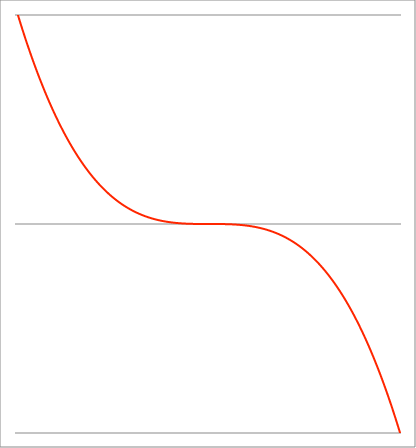
| Category | Series 1 |
|---|---|
| -1.01 | 1.03 |
| -1.00899 | 1.027 |
| -1.00798 | 1.024 |
| -1.00697 | 1.021 |
| -1.00596 | 1.018 |
| -1.00495 | 1.015 |
| -1.00394 | 1.012 |
| -1.00293 | 1.009 |
| -1.00192 | 1.006 |
| -1.00091 | 1.003 |
| -0.9999 | 1 |
| -0.99889 | 0.997 |
| -0.99788 | 0.994 |
| -0.996870000000001 | 0.991 |
| -0.995860000000001 | 0.988 |
| -0.994850000000001 | 0.985 |
| -0.993840000000001 | 0.982 |
| -0.992830000000001 | 0.979 |
| -0.991820000000001 | 0.976 |
| -0.990810000000001 | 0.973 |
| -0.989800000000001 | 0.97 |
| -0.988790000000001 | 0.967 |
| -0.987780000000001 | 0.964 |
| -0.986770000000001 | 0.961 |
| -0.985760000000001 | 0.958 |
| -0.984750000000001 | 0.955 |
| -0.983740000000001 | 0.952 |
| -0.982730000000001 | 0.949 |
| -0.981720000000001 | 0.946 |
| -0.980710000000001 | 0.943 |
| -0.979700000000001 | 0.94 |
| -0.978690000000001 | 0.937 |
| -0.977680000000001 | 0.935 |
| -0.976670000000001 | 0.932 |
| -0.975660000000001 | 0.929 |
| -0.974650000000002 | 0.926 |
| -0.973640000000002 | 0.923 |
| -0.972630000000002 | 0.92 |
| -0.971620000000002 | 0.917 |
| -0.970610000000002 | 0.914 |
| -0.969600000000002 | 0.912 |
| -0.968590000000002 | 0.909 |
| -0.967580000000002 | 0.906 |
| -0.966570000000002 | 0.903 |
| -0.965560000000002 | 0.9 |
| -0.964550000000002 | 0.897 |
| -0.963540000000002 | 0.895 |
| -0.962530000000002 | 0.892 |
| -0.961520000000002 | 0.889 |
| -0.960510000000002 | 0.886 |
| -0.959500000000002 | 0.883 |
| -0.958490000000002 | 0.881 |
| -0.957480000000002 | 0.878 |
| -0.956470000000002 | 0.875 |
| -0.955460000000002 | 0.872 |
| -0.954450000000002 | 0.869 |
| -0.953440000000002 | 0.867 |
| -0.952430000000003 | 0.864 |
| -0.951420000000003 | 0.861 |
| -0.950410000000003 | 0.858 |
| -0.949400000000003 | 0.856 |
| -0.948390000000003 | 0.853 |
| -0.947380000000003 | 0.85 |
| -0.946370000000003 | 0.848 |
| -0.945360000000003 | 0.845 |
| -0.944350000000003 | 0.842 |
| -0.943340000000003 | 0.839 |
| -0.942330000000003 | 0.837 |
| -0.941320000000003 | 0.834 |
| -0.940310000000003 | 0.831 |
| -0.939300000000003 | 0.829 |
| -0.938290000000003 | 0.826 |
| -0.937280000000003 | 0.823 |
| -0.936270000000003 | 0.821 |
| -0.935260000000003 | 0.818 |
| -0.934250000000003 | 0.815 |
| -0.933240000000003 | 0.813 |
| -0.932230000000003 | 0.81 |
| -0.931220000000003 | 0.808 |
| -0.930210000000004 | 0.805 |
| -0.929200000000004 | 0.802 |
| -0.928190000000004 | 0.8 |
| -0.927180000000004 | 0.797 |
| -0.926170000000004 | 0.794 |
| -0.925160000000004 | 0.792 |
| -0.924150000000004 | 0.789 |
| -0.923140000000004 | 0.787 |
| -0.922130000000004 | 0.784 |
| -0.921120000000004 | 0.782 |
| -0.920110000000004 | 0.779 |
| -0.919100000000004 | 0.776 |
| -0.918090000000004 | 0.774 |
| -0.917080000000004 | 0.771 |
| -0.916070000000004 | 0.769 |
| -0.915060000000004 | 0.766 |
| -0.914050000000004 | 0.764 |
| -0.913040000000004 | 0.761 |
| -0.912030000000004 | 0.759 |
| -0.911020000000004 | 0.756 |
| -0.910010000000004 | 0.754 |
| -0.909000000000004 | 0.751 |
| -0.907990000000004 | 0.749 |
| -0.906980000000005 | 0.746 |
| -0.905970000000005 | 0.744 |
| -0.904960000000005 | 0.741 |
| -0.903950000000005 | 0.739 |
| -0.902940000000005 | 0.736 |
| -0.901930000000005 | 0.734 |
| -0.900920000000005 | 0.731 |
| -0.899910000000005 | 0.729 |
| -0.898900000000005 | 0.726 |
| -0.897890000000005 | 0.724 |
| -0.896880000000005 | 0.721 |
| -0.895870000000005 | 0.719 |
| -0.894860000000005 | 0.717 |
| -0.893850000000005 | 0.714 |
| -0.892840000000005 | 0.712 |
| -0.891830000000005 | 0.709 |
| -0.890820000000005 | 0.707 |
| -0.889810000000005 | 0.705 |
| -0.888800000000005 | 0.702 |
| -0.887790000000005 | 0.7 |
| -0.886780000000005 | 0.697 |
| -0.885770000000005 | 0.695 |
| -0.884760000000005 | 0.693 |
| -0.883750000000006 | 0.69 |
| -0.882740000000006 | 0.688 |
| -0.881730000000006 | 0.685 |
| -0.880720000000006 | 0.683 |
| -0.879710000000006 | 0.681 |
| -0.878700000000006 | 0.678 |
| -0.877690000000006 | 0.676 |
| -0.876680000000006 | 0.674 |
| -0.875670000000006 | 0.671 |
| -0.874660000000006 | 0.669 |
| -0.873650000000006 | 0.667 |
| -0.872640000000006 | 0.665 |
| -0.871630000000006 | 0.662 |
| -0.870620000000006 | 0.66 |
| -0.869610000000006 | 0.658 |
| -0.868600000000006 | 0.655 |
| -0.867590000000006 | 0.653 |
| -0.866580000000006 | 0.651 |
| -0.865570000000006 | 0.648 |
| -0.864560000000006 | 0.646 |
| -0.863550000000006 | 0.644 |
| -0.862540000000006 | 0.642 |
| -0.861530000000007 | 0.639 |
| -0.860520000000007 | 0.637 |
| -0.859510000000007 | 0.635 |
| -0.858500000000007 | 0.633 |
| -0.857490000000007 | 0.631 |
| -0.856480000000007 | 0.628 |
| -0.855470000000007 | 0.626 |
| -0.854460000000007 | 0.624 |
| -0.853450000000007 | 0.622 |
| -0.852440000000007 | 0.619 |
| -0.851430000000007 | 0.617 |
| -0.850420000000007 | 0.615 |
| -0.849410000000007 | 0.613 |
| -0.848400000000007 | 0.611 |
| -0.847390000000007 | 0.608 |
| -0.846380000000007 | 0.606 |
| -0.845370000000007 | 0.604 |
| -0.844360000000007 | 0.602 |
| -0.843350000000007 | 0.6 |
| -0.842340000000007 | 0.598 |
| -0.841330000000007 | 0.596 |
| -0.840320000000007 | 0.593 |
| -0.839310000000007 | 0.591 |
| -0.838300000000008 | 0.589 |
| -0.837290000000008 | 0.587 |
| -0.836280000000008 | 0.585 |
| -0.835270000000008 | 0.583 |
| -0.834260000000008 | 0.581 |
| -0.833250000000008 | 0.579 |
| -0.832240000000008 | 0.576 |
| -0.831230000000008 | 0.574 |
| -0.830220000000008 | 0.572 |
| -0.829210000000008 | 0.57 |
| -0.828200000000008 | 0.568 |
| -0.827190000000008 | 0.566 |
| -0.826180000000008 | 0.564 |
| -0.825170000000008 | 0.562 |
| -0.824160000000008 | 0.56 |
| -0.823150000000008 | 0.558 |
| -0.822140000000008 | 0.556 |
| -0.821130000000008 | 0.554 |
| -0.820120000000008 | 0.552 |
| -0.819110000000008 | 0.55 |
| -0.818100000000008 | 0.548 |
| -0.817090000000008 | 0.546 |
| -0.816080000000009 | 0.543 |
| -0.815070000000009 | 0.541 |
| -0.814060000000009 | 0.539 |
| -0.813050000000009 | 0.537 |
| -0.812040000000009 | 0.535 |
| -0.811030000000009 | 0.533 |
| -0.810020000000009 | 0.531 |
| -0.809010000000009 | 0.529 |
| -0.808000000000009 | 0.528 |
| -0.806990000000009 | 0.526 |
| -0.805980000000009 | 0.524 |
| -0.804970000000009 | 0.522 |
| -0.803960000000009 | 0.52 |
| -0.802950000000009 | 0.518 |
| -0.801940000000009 | 0.516 |
| -0.800930000000009 | 0.514 |
| -0.799920000000009 | 0.512 |
| -0.798910000000009 | 0.51 |
| -0.797900000000009 | 0.508 |
| -0.796890000000009 | 0.506 |
| -0.795880000000009 | 0.504 |
| -0.794870000000009 | 0.502 |
| -0.793860000000009 | 0.5 |
| -0.79285000000001 | 0.498 |
| -0.79184000000001 | 0.496 |
| -0.79083000000001 | 0.495 |
| -0.78982000000001 | 0.493 |
| -0.78881000000001 | 0.491 |
| -0.78780000000001 | 0.489 |
| -0.78679000000001 | 0.487 |
| -0.78578000000001 | 0.485 |
| -0.78477000000001 | 0.483 |
| -0.78376000000001 | 0.481 |
| -0.78275000000001 | 0.48 |
| -0.78174000000001 | 0.478 |
| -0.78073000000001 | 0.476 |
| -0.77972000000001 | 0.474 |
| -0.77871000000001 | 0.472 |
| -0.77770000000001 | 0.47 |
| -0.77669000000001 | 0.469 |
| -0.77568000000001 | 0.467 |
| -0.77467000000001 | 0.465 |
| -0.77366000000001 | 0.463 |
| -0.77265000000001 | 0.461 |
| -0.77164000000001 | 0.459 |
| -0.770630000000011 | 0.458 |
| -0.769620000000011 | 0.456 |
| -0.768610000000011 | 0.454 |
| -0.767600000000011 | 0.452 |
| -0.766590000000011 | 0.45 |
| -0.765580000000011 | 0.449 |
| -0.764570000000011 | 0.447 |
| -0.763560000000011 | 0.445 |
| -0.762550000000011 | 0.443 |
| -0.761540000000011 | 0.442 |
| -0.760530000000011 | 0.44 |
| -0.759520000000011 | 0.438 |
| -0.758510000000011 | 0.436 |
| -0.757500000000011 | 0.435 |
| -0.756490000000011 | 0.433 |
| -0.755480000000011 | 0.431 |
| -0.754470000000011 | 0.429 |
| -0.753460000000011 | 0.428 |
| -0.752450000000011 | 0.426 |
| -0.751440000000011 | 0.424 |
| -0.750430000000011 | 0.423 |
| -0.749420000000011 | 0.421 |
| -0.748410000000011 | 0.419 |
| -0.747400000000012 | 0.418 |
| -0.746390000000012 | 0.416 |
| -0.745380000000012 | 0.414 |
| -0.744370000000012 | 0.412 |
| -0.743360000000012 | 0.411 |
| -0.742350000000012 | 0.409 |
| -0.741340000000012 | 0.407 |
| -0.740330000000012 | 0.406 |
| -0.739320000000012 | 0.404 |
| -0.738310000000012 | 0.402 |
| -0.737300000000012 | 0.401 |
| -0.736290000000012 | 0.399 |
| -0.735280000000012 | 0.398 |
| -0.734270000000012 | 0.396 |
| -0.733260000000012 | 0.394 |
| -0.732250000000012 | 0.393 |
| -0.731240000000012 | 0.391 |
| -0.730230000000012 | 0.389 |
| -0.729220000000012 | 0.388 |
| -0.728210000000012 | 0.386 |
| -0.727200000000012 | 0.385 |
| -0.726190000000012 | 0.383 |
| -0.725180000000013 | 0.381 |
| -0.724170000000013 | 0.38 |
| -0.723160000000013 | 0.378 |
| -0.722150000000013 | 0.377 |
| -0.721140000000013 | 0.375 |
| -0.720130000000013 | 0.373 |
| -0.719120000000013 | 0.372 |
| -0.718110000000013 | 0.37 |
| -0.717100000000013 | 0.369 |
| -0.716090000000013 | 0.367 |
| -0.715080000000013 | 0.366 |
| -0.714070000000013 | 0.364 |
| -0.713060000000013 | 0.363 |
| -0.712050000000013 | 0.361 |
| -0.711040000000013 | 0.359 |
| -0.710030000000013 | 0.358 |
| -0.709020000000013 | 0.356 |
| -0.708010000000013 | 0.355 |
| -0.707000000000013 | 0.353 |
| -0.705990000000013 | 0.352 |
| -0.704980000000013 | 0.35 |
| -0.703970000000013 | 0.349 |
| -0.702960000000014 | 0.347 |
| -0.701950000000014 | 0.346 |
| -0.700940000000014 | 0.344 |
| -0.699930000000014 | 0.343 |
| -0.698920000000014 | 0.341 |
| -0.697910000000014 | 0.34 |
| -0.696900000000014 | 0.338 |
| -0.695890000000014 | 0.337 |
| -0.694880000000014 | 0.336 |
| -0.693870000000014 | 0.334 |
| -0.692860000000014 | 0.333 |
| -0.691850000000014 | 0.331 |
| -0.690840000000014 | 0.33 |
| -0.689830000000014 | 0.328 |
| -0.688820000000014 | 0.327 |
| -0.687810000000014 | 0.325 |
| -0.686800000000014 | 0.324 |
| -0.685790000000014 | 0.323 |
| -0.684780000000014 | 0.321 |
| -0.683770000000014 | 0.32 |
| -0.682760000000014 | 0.318 |
| -0.681750000000014 | 0.317 |
| -0.680740000000014 | 0.315 |
| -0.679730000000015 | 0.314 |
| -0.678720000000015 | 0.313 |
| -0.677710000000015 | 0.311 |
| -0.676700000000015 | 0.31 |
| -0.675690000000015 | 0.308 |
| -0.674680000000015 | 0.307 |
| -0.673670000000015 | 0.306 |
| -0.672660000000015 | 0.304 |
| -0.671650000000015 | 0.303 |
| -0.670640000000015 | 0.302 |
| -0.669630000000015 | 0.3 |
| -0.668620000000015 | 0.299 |
| -0.667610000000015 | 0.298 |
| -0.666600000000015 | 0.296 |
| -0.665590000000015 | 0.295 |
| -0.664580000000015 | 0.294 |
| -0.663570000000015 | 0.292 |
| -0.662560000000015 | 0.291 |
| -0.661550000000015 | 0.29 |
| -0.660540000000015 | 0.288 |
| -0.659530000000015 | 0.287 |
| -0.658520000000015 | 0.286 |
| -0.657510000000015 | 0.284 |
| -0.656500000000016 | 0.283 |
| -0.655490000000016 | 0.282 |
| -0.654480000000016 | 0.28 |
| -0.653470000000016 | 0.279 |
| -0.652460000000016 | 0.278 |
| -0.651450000000016 | 0.276 |
| -0.650440000000016 | 0.275 |
| -0.649430000000016 | 0.274 |
| -0.648420000000016 | 0.273 |
| -0.647410000000016 | 0.271 |
| -0.646400000000016 | 0.27 |
| -0.645390000000016 | 0.269 |
| -0.644380000000016 | 0.268 |
| -0.643370000000016 | 0.266 |
| -0.642360000000016 | 0.265 |
| -0.641350000000016 | 0.264 |
| -0.640340000000016 | 0.263 |
| -0.639330000000016 | 0.261 |
| -0.638320000000016 | 0.26 |
| -0.637310000000016 | 0.259 |
| -0.636300000000016 | 0.258 |
| -0.635290000000016 | 0.256 |
| -0.634280000000017 | 0.255 |
| -0.633270000000017 | 0.254 |
| -0.632260000000017 | 0.253 |
| -0.631250000000017 | 0.252 |
| -0.630240000000017 | 0.25 |
| -0.629230000000017 | 0.249 |
| -0.628220000000017 | 0.248 |
| -0.627210000000017 | 0.247 |
| -0.626200000000017 | 0.246 |
| -0.625190000000017 | 0.244 |
| -0.624180000000017 | 0.243 |
| -0.623170000000017 | 0.242 |
| -0.622160000000017 | 0.241 |
| -0.621150000000017 | 0.24 |
| -0.620140000000017 | 0.238 |
| -0.619130000000017 | 0.237 |
| -0.618120000000017 | 0.236 |
| -0.617110000000017 | 0.235 |
| -0.616100000000017 | 0.234 |
| -0.615090000000017 | 0.233 |
| -0.614080000000017 | 0.232 |
| -0.613070000000017 | 0.23 |
| -0.612060000000017 | 0.229 |
| -0.611050000000018 | 0.228 |
| -0.610040000000018 | 0.227 |
| -0.609030000000018 | 0.226 |
| -0.608020000000018 | 0.225 |
| -0.607010000000018 | 0.224 |
| -0.606000000000018 | 0.223 |
| -0.604990000000018 | 0.221 |
| -0.603980000000018 | 0.22 |
| -0.602970000000018 | 0.219 |
| -0.601960000000018 | 0.218 |
| -0.600950000000018 | 0.217 |
| -0.599940000000018 | 0.216 |
| -0.598930000000018 | 0.215 |
| -0.597920000000018 | 0.214 |
| -0.596910000000018 | 0.213 |
| -0.595900000000018 | 0.212 |
| -0.594890000000018 | 0.211 |
| -0.593880000000018 | 0.209 |
| -0.592870000000018 | 0.208 |
| -0.591860000000018 | 0.207 |
| -0.590850000000019 | 0.206 |
| -0.589840000000019 | 0.205 |
| -0.588830000000019 | 0.204 |
| -0.587820000000019 | 0.203 |
| -0.586810000000019 | 0.202 |
| -0.585800000000019 | 0.201 |
| -0.584790000000019 | 0.2 |
| -0.583780000000019 | 0.199 |
| -0.582770000000019 | 0.198 |
| -0.581760000000019 | 0.197 |
| -0.580750000000019 | 0.196 |
| -0.579740000000019 | 0.195 |
| -0.578730000000019 | 0.194 |
| -0.577720000000019 | 0.193 |
| -0.576710000000019 | 0.192 |
| -0.575700000000019 | 0.191 |
| -0.574690000000019 | 0.19 |
| -0.573680000000019 | 0.189 |
| -0.572670000000019 | 0.188 |
| -0.571660000000019 | 0.187 |
| -0.570650000000019 | 0.186 |
| -0.569640000000019 | 0.185 |
| -0.568630000000019 | 0.184 |
| -0.56762000000002 | 0.183 |
| -0.56661000000002 | 0.182 |
| -0.56560000000002 | 0.181 |
| -0.56459000000002 | 0.18 |
| -0.56358000000002 | 0.179 |
| -0.56257000000002 | 0.178 |
| -0.56156000000002 | 0.177 |
| -0.56055000000002 | 0.176 |
| -0.55954000000002 | 0.175 |
| -0.55853000000002 | 0.174 |
| -0.55752000000002 | 0.173 |
| -0.55651000000002 | 0.172 |
| -0.55550000000002 | 0.171 |
| -0.55449000000002 | 0.17 |
| -0.55348000000002 | 0.17 |
| -0.55247000000002 | 0.169 |
| -0.55146000000002 | 0.168 |
| -0.55045000000002 | 0.167 |
| -0.54944000000002 | 0.166 |
| -0.54843000000002 | 0.165 |
| -0.54742000000002 | 0.164 |
| -0.54641000000002 | 0.163 |
| -0.545400000000021 | 0.162 |
| -0.544390000000021 | 0.161 |
| -0.543380000000021 | 0.16 |
| -0.542370000000021 | 0.16 |
| -0.541360000000021 | 0.159 |
| -0.540350000000021 | 0.158 |
| -0.539340000000021 | 0.157 |
| -0.538330000000021 | 0.156 |
| -0.537320000000021 | 0.155 |
| -0.536310000000021 | 0.154 |
| -0.535300000000021 | 0.153 |
| -0.534290000000021 | 0.153 |
| -0.533280000000021 | 0.152 |
| -0.532270000000021 | 0.151 |
| -0.531260000000021 | 0.15 |
| -0.530250000000021 | 0.149 |
| -0.529240000000021 | 0.148 |
| -0.528230000000021 | 0.147 |
| -0.527220000000021 | 0.147 |
| -0.526210000000021 | 0.146 |
| -0.525200000000021 | 0.145 |
| -0.524190000000021 | 0.144 |
| -0.523180000000022 | 0.143 |
| -0.522170000000022 | 0.142 |
| -0.521160000000022 | 0.142 |
| -0.520150000000022 | 0.141 |
| -0.519140000000022 | 0.14 |
| -0.518130000000022 | 0.139 |
| -0.517120000000022 | 0.138 |
| -0.516110000000022 | 0.137 |
| -0.515100000000022 | 0.137 |
| -0.514090000000022 | 0.136 |
| -0.513080000000022 | 0.135 |
| -0.512070000000022 | 0.134 |
| -0.511060000000022 | 0.133 |
| -0.510050000000022 | 0.133 |
| -0.509040000000022 | 0.132 |
| -0.508030000000022 | 0.131 |
| -0.507020000000022 | 0.13 |
| -0.506010000000022 | 0.13 |
| -0.505000000000022 | 0.129 |
| -0.503990000000022 | 0.128 |
| -0.502980000000022 | 0.127 |
| -0.501970000000022 | 0.126 |
| -0.500960000000022 | 0.126 |
| -0.499950000000022 | 0.125 |
| -0.498940000000022 | 0.124 |
| -0.497930000000022 | 0.123 |
| -0.496920000000022 | 0.123 |
| -0.495910000000022 | 0.122 |
| -0.494900000000022 | 0.121 |
| -0.493890000000022 | 0.12 |
| -0.492880000000022 | 0.12 |
| -0.491870000000022 | 0.119 |
| -0.490860000000022 | 0.118 |
| -0.489850000000022 | 0.118 |
| -0.488840000000022 | 0.117 |
| -0.487830000000022 | 0.116 |
| -0.486820000000022 | 0.115 |
| -0.485810000000022 | 0.115 |
| -0.484800000000022 | 0.114 |
| -0.483790000000022 | 0.113 |
| -0.482780000000022 | 0.113 |
| -0.481770000000022 | 0.112 |
| -0.480760000000022 | 0.111 |
| -0.479750000000022 | 0.11 |
| -0.478740000000022 | 0.11 |
| -0.477730000000022 | 0.109 |
| -0.476720000000022 | 0.108 |
| -0.475710000000022 | 0.108 |
| -0.474700000000022 | 0.107 |
| -0.473690000000022 | 0.106 |
| -0.472680000000022 | 0.106 |
| -0.471670000000022 | 0.105 |
| -0.470660000000022 | 0.104 |
| -0.469650000000022 | 0.104 |
| -0.468640000000022 | 0.103 |
| -0.467630000000022 | 0.102 |
| -0.466620000000022 | 0.102 |
| -0.465610000000022 | 0.101 |
| -0.464600000000022 | 0.1 |
| -0.463590000000022 | 0.1 |
| -0.462580000000022 | 0.099 |
| -0.461570000000022 | 0.098 |
| -0.460560000000022 | 0.098 |
| -0.459550000000022 | 0.097 |
| -0.458540000000022 | 0.096 |
| -0.457530000000022 | 0.096 |
| -0.456520000000022 | 0.095 |
| -0.455510000000022 | 0.095 |
| -0.454500000000022 | 0.094 |
| -0.453490000000022 | 0.093 |
| -0.452480000000022 | 0.093 |
| -0.451470000000022 | 0.092 |
| -0.450460000000022 | 0.091 |
| -0.449450000000022 | 0.091 |
| -0.448440000000022 | 0.09 |
| -0.447430000000022 | 0.09 |
| -0.446420000000022 | 0.089 |
| -0.445410000000022 | 0.088 |
| -0.444400000000022 | 0.088 |
| -0.443390000000022 | 0.087 |
| -0.442380000000022 | 0.087 |
| -0.441370000000022 | 0.086 |
| -0.440360000000022 | 0.085 |
| -0.439350000000022 | 0.085 |
| -0.438340000000022 | 0.084 |
| -0.437330000000022 | 0.084 |
| -0.436320000000022 | 0.083 |
| -0.435310000000022 | 0.082 |
| -0.434300000000022 | 0.082 |
| -0.433290000000022 | 0.081 |
| -0.432280000000022 | 0.081 |
| -0.431270000000022 | 0.08 |
| -0.430260000000022 | 0.08 |
| -0.429250000000022 | 0.079 |
| -0.428240000000022 | 0.079 |
| -0.427230000000022 | 0.078 |
| -0.426220000000022 | 0.077 |
| -0.425210000000022 | 0.077 |
| -0.424200000000022 | 0.076 |
| -0.423190000000022 | 0.076 |
| -0.422180000000022 | 0.075 |
| -0.421170000000022 | 0.075 |
| -0.420160000000022 | 0.074 |
| -0.419150000000022 | 0.074 |
| -0.418140000000022 | 0.073 |
| -0.417130000000022 | 0.073 |
| -0.416120000000022 | 0.072 |
| -0.415110000000022 | 0.072 |
| -0.414100000000022 | 0.071 |
| -0.413090000000022 | 0.07 |
| -0.412080000000022 | 0.07 |
| -0.411070000000022 | 0.069 |
| -0.410060000000021 | 0.069 |
| -0.409050000000021 | 0.068 |
| -0.408040000000021 | 0.068 |
| -0.407030000000021 | 0.067 |
| -0.406020000000021 | 0.067 |
| -0.405010000000021 | 0.066 |
| -0.404000000000021 | 0.066 |
| -0.402990000000021 | 0.065 |
| -0.401980000000021 | 0.065 |
| -0.400970000000021 | 0.064 |
| -0.399960000000021 | 0.064 |
| -0.398950000000021 | 0.063 |
| -0.397940000000021 | 0.063 |
| -0.396930000000021 | 0.063 |
| -0.395920000000021 | 0.062 |
| -0.394910000000021 | 0.062 |
| -0.393900000000021 | 0.061 |
| -0.392890000000021 | 0.061 |
| -0.391880000000021 | 0.06 |
| -0.390870000000021 | 0.06 |
| -0.389860000000021 | 0.059 |
| -0.388850000000021 | 0.059 |
| -0.387840000000021 | 0.058 |
| -0.386830000000021 | 0.058 |
| -0.385820000000021 | 0.057 |
| -0.384810000000021 | 0.057 |
| -0.383800000000021 | 0.057 |
| -0.382790000000021 | 0.056 |
| -0.381780000000021 | 0.056 |
| -0.380770000000021 | 0.055 |
| -0.379760000000021 | 0.055 |
| -0.378750000000021 | 0.054 |
| -0.377740000000021 | 0.054 |
| -0.376730000000021 | 0.053 |
| -0.375720000000021 | 0.053 |
| -0.374710000000021 | 0.053 |
| -0.373700000000021 | 0.052 |
| -0.372690000000021 | 0.052 |
| -0.371680000000021 | 0.051 |
| -0.370670000000021 | 0.051 |
| -0.369660000000021 | 0.051 |
| -0.368650000000021 | 0.05 |
| -0.367640000000021 | 0.05 |
| -0.366630000000021 | 0.049 |
| -0.365620000000021 | 0.049 |
| -0.364610000000021 | 0.048 |
| -0.363600000000021 | 0.048 |
| -0.362590000000021 | 0.048 |
| -0.361580000000021 | 0.047 |
| -0.360570000000021 | 0.047 |
| -0.359560000000021 | 0.046 |
| -0.358550000000021 | 0.046 |
| -0.357540000000021 | 0.046 |
| -0.356530000000021 | 0.045 |
| -0.355520000000021 | 0.045 |
| -0.354510000000021 | 0.045 |
| -0.353500000000021 | 0.044 |
| -0.352490000000021 | 0.044 |
| -0.351480000000021 | 0.043 |
| -0.350470000000021 | 0.043 |
| -0.349460000000021 | 0.043 |
| -0.348450000000021 | 0.042 |
| -0.347440000000021 | 0.042 |
| -0.346430000000021 | 0.042 |
| -0.345420000000021 | 0.041 |
| -0.344410000000021 | 0.041 |
| -0.343400000000021 | 0.04 |
| -0.342390000000021 | 0.04 |
| -0.341380000000021 | 0.04 |
| -0.340370000000021 | 0.039 |
| -0.339360000000021 | 0.039 |
| -0.338350000000021 | 0.039 |
| -0.337340000000021 | 0.038 |
| -0.336330000000021 | 0.038 |
| -0.335320000000021 | 0.038 |
| -0.334310000000021 | 0.037 |
| -0.333300000000021 | 0.037 |
| -0.332290000000021 | 0.037 |
| -0.331280000000021 | 0.036 |
| -0.330270000000021 | 0.036 |
| -0.329260000000021 | 0.036 |
| -0.328250000000021 | 0.035 |
| -0.327240000000021 | 0.035 |
| -0.326230000000021 | 0.035 |
| -0.325220000000021 | 0.034 |
| -0.324210000000021 | 0.034 |
| -0.323200000000021 | 0.034 |
| -0.322190000000021 | 0.033 |
| -0.321180000000021 | 0.033 |
| -0.320170000000021 | 0.033 |
| -0.31916000000002 | 0.033 |
| -0.31815000000002 | 0.032 |
| -0.31714000000002 | 0.032 |
| -0.31613000000002 | 0.032 |
| -0.31512000000002 | 0.031 |
| -0.31411000000002 | 0.031 |
| -0.31310000000002 | 0.031 |
| -0.31209000000002 | 0.03 |
| -0.31108000000002 | 0.03 |
| -0.31007000000002 | 0.03 |
| -0.30906000000002 | 0.03 |
| -0.30805000000002 | 0.029 |
| -0.30704000000002 | 0.029 |
| -0.30603000000002 | 0.029 |
| -0.30502000000002 | 0.028 |
| -0.30401000000002 | 0.028 |
| -0.30300000000002 | 0.028 |
| -0.30199000000002 | 0.028 |
| -0.30098000000002 | 0.027 |
| -0.29997000000002 | 0.027 |
| -0.29896000000002 | 0.027 |
| -0.29795000000002 | 0.026 |
| -0.29694000000002 | 0.026 |
| -0.29593000000002 | 0.026 |
| -0.29492000000002 | 0.026 |
| -0.29391000000002 | 0.025 |
| -0.29290000000002 | 0.025 |
| -0.29189000000002 | 0.025 |
| -0.29088000000002 | 0.025 |
| -0.28987000000002 | 0.024 |
| -0.28886000000002 | 0.024 |
| -0.28785000000002 | 0.024 |
| -0.28684000000002 | 0.024 |
| -0.28583000000002 | 0.023 |
| -0.28482000000002 | 0.023 |
| -0.28381000000002 | 0.023 |
| -0.28280000000002 | 0.023 |
| -0.28179000000002 | 0.022 |
| -0.28078000000002 | 0.022 |
| -0.27977000000002 | 0.022 |
| -0.27876000000002 | 0.022 |
| -0.27775000000002 | 0.021 |
| -0.27674000000002 | 0.021 |
| -0.27573000000002 | 0.021 |
| -0.27472000000002 | 0.021 |
| -0.27371000000002 | 0.021 |
| -0.27270000000002 | 0.02 |
| -0.27169000000002 | 0.02 |
| -0.27068000000002 | 0.02 |
| -0.26967000000002 | 0.02 |
| -0.26866000000002 | 0.019 |
| -0.26765000000002 | 0.019 |
| -0.26664000000002 | 0.019 |
| -0.26563000000002 | 0.019 |
| -0.26462000000002 | 0.019 |
| -0.26361000000002 | 0.018 |
| -0.26260000000002 | 0.018 |
| -0.26159000000002 | 0.018 |
| -0.26058000000002 | 0.018 |
| -0.25957000000002 | 0.017 |
| -0.25856000000002 | 0.017 |
| -0.25755000000002 | 0.017 |
| -0.25654000000002 | 0.017 |
| -0.25553000000002 | 0.017 |
| -0.25452000000002 | 0.016 |
| -0.25351000000002 | 0.016 |
| -0.25250000000002 | 0.016 |
| -0.25149000000002 | 0.016 |
| -0.25048000000002 | 0.016 |
| -0.24947000000002 | 0.016 |
| -0.24846000000002 | 0.015 |
| -0.24745000000002 | 0.015 |
| -0.24644000000002 | 0.015 |
| -0.24543000000002 | 0.015 |
| -0.24442000000002 | 0.015 |
| -0.24341000000002 | 0.014 |
| -0.24240000000002 | 0.014 |
| -0.24139000000002 | 0.014 |
| -0.24038000000002 | 0.014 |
| -0.23937000000002 | 0.014 |
| -0.23836000000002 | 0.014 |
| -0.23735000000002 | 0.013 |
| -0.23634000000002 | 0.013 |
| -0.23533000000002 | 0.013 |
| -0.23432000000002 | 0.013 |
| -0.23331000000002 | 0.013 |
| -0.23230000000002 | 0.013 |
| -0.23129000000002 | 0.012 |
| -0.23028000000002 | 0.012 |
| -0.22927000000002 | 0.012 |
| -0.22826000000002 | 0.012 |
| -0.22725000000002 | 0.012 |
| -0.22624000000002 | 0.012 |
| -0.22523000000002 | 0.011 |
| -0.224220000000019 | 0.011 |
| -0.223210000000019 | 0.011 |
| -0.222200000000019 | 0.011 |
| -0.221190000000019 | 0.011 |
| -0.220180000000019 | 0.011 |
| -0.219170000000019 | 0.011 |
| -0.218160000000019 | 0.01 |
| -0.217150000000019 | 0.01 |
| -0.216140000000019 | 0.01 |
| -0.215130000000019 | 0.01 |
| -0.214120000000019 | 0.01 |
| -0.213110000000019 | 0.01 |
| -0.212100000000019 | 0.01 |
| -0.211090000000019 | 0.009 |
| -0.210080000000019 | 0.009 |
| -0.209070000000019 | 0.009 |
| -0.208060000000019 | 0.009 |
| -0.207050000000019 | 0.009 |
| -0.206040000000019 | 0.009 |
| -0.205030000000019 | 0.009 |
| -0.204020000000019 | 0.008 |
| -0.203010000000019 | 0.008 |
| -0.202000000000019 | 0.008 |
| -0.200990000000019 | 0.008 |
| -0.199980000000019 | 0.008 |
| -0.198970000000019 | 0.008 |
| -0.197960000000019 | 0.008 |
| -0.196950000000019 | 0.008 |
| -0.195940000000019 | 0.008 |
| -0.194930000000019 | 0.007 |
| -0.193920000000019 | 0.007 |
| -0.192910000000019 | 0.007 |
| -0.191900000000019 | 0.007 |
| -0.190890000000019 | 0.007 |
| -0.189880000000019 | 0.007 |
| -0.188870000000019 | 0.007 |
| -0.187860000000019 | 0.007 |
| -0.186850000000019 | 0.007 |
| -0.185840000000019 | 0.006 |
| -0.184830000000019 | 0.006 |
| -0.183820000000019 | 0.006 |
| -0.182810000000019 | 0.006 |
| -0.181800000000019 | 0.006 |
| -0.180790000000019 | 0.006 |
| -0.179780000000019 | 0.006 |
| -0.178770000000019 | 0.006 |
| -0.177760000000019 | 0.006 |
| -0.176750000000019 | 0.006 |
| -0.175740000000019 | 0.005 |
| -0.174730000000019 | 0.005 |
| -0.173720000000019 | 0.005 |
| -0.172710000000019 | 0.005 |
| -0.171700000000019 | 0.005 |
| -0.170690000000019 | 0.005 |
| -0.169680000000019 | 0.005 |
| -0.168670000000019 | 0.005 |
| -0.167660000000019 | 0.005 |
| -0.166650000000019 | 0.005 |
| -0.165640000000019 | 0.005 |
| -0.164630000000019 | 0.004 |
| -0.163620000000019 | 0.004 |
| -0.162610000000019 | 0.004 |
| -0.161600000000019 | 0.004 |
| -0.160590000000019 | 0.004 |
| -0.159580000000019 | 0.004 |
| -0.158570000000019 | 0.004 |
| -0.157560000000019 | 0.004 |
| -0.156550000000019 | 0.004 |
| -0.155540000000019 | 0.004 |
| -0.154530000000019 | 0.004 |
| -0.153520000000019 | 0.004 |
| -0.152510000000019 | 0.004 |
| -0.151500000000019 | 0.003 |
| -0.150490000000019 | 0.003 |
| -0.149480000000019 | 0.003 |
| -0.148470000000019 | 0.003 |
| -0.147460000000019 | 0.003 |
| -0.146450000000019 | 0.003 |
| -0.145440000000019 | 0.003 |
| -0.144430000000019 | 0.003 |
| -0.143420000000019 | 0.003 |
| -0.142410000000019 | 0.003 |
| -0.141400000000019 | 0.003 |
| -0.140390000000019 | 0.003 |
| -0.139380000000019 | 0.003 |
| -0.138370000000019 | 0.003 |
| -0.137360000000019 | 0.003 |
| -0.136350000000019 | 0.003 |
| -0.135340000000019 | 0.002 |
| -0.134330000000019 | 0.002 |
| -0.133320000000019 | 0.002 |
| -0.132310000000019 | 0.002 |
| -0.131300000000019 | 0.002 |
| -0.130290000000018 | 0.002 |
| -0.129280000000018 | 0.002 |
| -0.128270000000018 | 0.002 |
| -0.127260000000018 | 0.002 |
| -0.126250000000018 | 0.002 |
| -0.125240000000018 | 0.002 |
| -0.124230000000018 | 0.002 |
| -0.123220000000018 | 0.002 |
| -0.122210000000018 | 0.002 |
| -0.121200000000018 | 0.002 |
| -0.120190000000018 | 0.002 |
| -0.119180000000018 | 0.002 |
| -0.118170000000018 | 0.002 |
| -0.117160000000018 | 0.002 |
| -0.116150000000018 | 0.002 |
| -0.115140000000018 | 0.002 |
| -0.114130000000018 | 0.001 |
| -0.113120000000018 | 0.001 |
| -0.112110000000018 | 0.001 |
| -0.111100000000018 | 0.001 |
| -0.110090000000018 | 0.001 |
| -0.109080000000018 | 0.001 |
| -0.108070000000018 | 0.001 |
| -0.107060000000018 | 0.001 |
| -0.106050000000018 | 0.001 |
| -0.105040000000019 | 0.001 |
| -0.104030000000019 | 0.001 |
| -0.103020000000019 | 0.001 |
| -0.102010000000019 | 0.001 |
| -0.101000000000019 | 0.001 |
| -0.0999900000000185 | 0.001 |
| -0.0989800000000185 | 0.001 |
| -0.0979700000000185 | 0.001 |
| -0.0969600000000185 | 0.001 |
| -0.0959500000000185 | 0.001 |
| -0.0949400000000185 | 0.001 |
| -0.0939300000000185 | 0.001 |
| -0.0929200000000185 | 0.001 |
| -0.0919100000000185 | 0.001 |
| -0.0909000000000185 | 0.001 |
| -0.0898900000000185 | 0.001 |
| -0.0888800000000185 | 0.001 |
| -0.0878700000000185 | 0.001 |
| -0.0868600000000185 | 0.001 |
| -0.0858500000000185 | 0.001 |
| -0.0848400000000186 | 0.001 |
| -0.0838300000000186 | 0.001 |
| -0.0828200000000186 | 0.001 |
| -0.0818100000000186 | 0.001 |
| -0.0808000000000186 | 0.001 |
| -0.0797900000000186 | 0.001 |
| -0.0787800000000186 | 0 |
| -0.0777700000000186 | 0 |
| -0.0767600000000186 | 0 |
| -0.0757500000000186 | 0 |
| -0.0747400000000186 | 0 |
| -0.0737300000000186 | 0 |
| -0.0727200000000186 | 0 |
| -0.0717100000000186 | 0 |
| -0.0707000000000186 | 0 |
| -0.0696900000000186 | 0 |
| -0.0686800000000186 | 0 |
| -0.0676700000000186 | 0 |
| -0.0666600000000186 | 0 |
| -0.0656500000000186 | 0 |
| -0.0646400000000186 | 0 |
| -0.0636300000000186 | 0 |
| -0.0626200000000186 | 0 |
| -0.0616100000000186 | 0 |
| -0.0606000000000186 | 0 |
| -0.0595900000000186 | 0 |
| -0.0585800000000186 | 0 |
| -0.0575700000000186 | 0 |
| -0.0565600000000186 | 0 |
| -0.0555500000000186 | 0 |
| -0.0545400000000186 | 0 |
| -0.0535300000000186 | 0 |
| -0.0525200000000187 | 0 |
| -0.0515100000000187 | 0 |
| -0.0505000000000187 | 0 |
| -0.0494900000000187 | 0 |
| -0.0484800000000187 | 0 |
| -0.0474700000000187 | 0 |
| -0.0464600000000187 | 0 |
| -0.0454500000000187 | 0 |
| -0.0444400000000187 | 0 |
| -0.0434300000000187 | 0 |
| -0.0424200000000187 | 0 |
| -0.0414100000000187 | 0 |
| -0.0404000000000187 | 0 |
| -0.0393900000000187 | 0 |
| -0.0383800000000187 | 0 |
| -0.0373700000000187 | 0 |
| -0.0363600000000187 | 0 |
| -0.0353500000000187 | 0 |
| -0.0343400000000187 | 0 |
| -0.0333300000000187 | 0 |
| -0.0323200000000187 | 0 |
| -0.0313100000000187 | 0 |
| -0.0303000000000187 | 0 |
| -0.0292900000000187 | 0 |
| -0.0282800000000187 | 0 |
| -0.0272700000000187 | 0 |
| -0.0262600000000187 | 0 |
| -0.0252500000000187 | 0 |
| -0.0242400000000187 | 0 |
| -0.0232300000000187 | 0 |
| -0.0222200000000187 | 0 |
| -0.0212100000000187 | 0 |
| -0.0202000000000187 | 0 |
| -0.0191900000000187 | 0 |
| -0.0181800000000187 | 0 |
| -0.0171700000000187 | 0 |
| -0.0161600000000187 | 0 |
| -0.0151500000000187 | 0 |
| -0.0141400000000187 | 0 |
| -0.0131300000000187 | 0 |
| -0.0121200000000187 | 0 |
| -0.0111100000000187 | 0 |
| -0.0101000000000187 | 0 |
| -0.00909000000001871 | 0 |
| -0.00808000000001871 | 0 |
| -0.00707000000001871 | 0 |
| -0.00606000000001871 | 0 |
| -0.00505000000001871 | 0 |
| -0.00404000000001871 | 0 |
| -0.00303000000001871 | 0 |
| -0.00202000000001871 | 0 |
| -0.00101000000001871 | 0 |
| -1.87124621353618e-14 | 0 |
| 0.00100999999998129 | 0 |
| 0.00201999999998129 | 0 |
| 0.00302999999998129 | 0 |
| 0.00403999999998129 | 0 |
| 0.00504999999998129 | 0 |
| 0.00605999999998129 | 0 |
| 0.00706999999998129 | 0 |
| 0.00807999999998129 | 0 |
| 0.00908999999998129 | 0 |
| 0.0100999999999813 | 0 |
| 0.0111099999999813 | 0 |
| 0.0121199999999813 | 0 |
| 0.0131299999999813 | 0 |
| 0.0141399999999813 | 0 |
| 0.0151499999999813 | 0 |
| 0.0161599999999813 | 0 |
| 0.0171699999999813 | 0 |
| 0.0181799999999813 | 0 |
| 0.0191899999999813 | 0 |
| 0.0201999999999813 | 0 |
| 0.0212099999999813 | 0 |
| 0.0222199999999813 | 0 |
| 0.0232299999999813 | 0 |
| 0.0242399999999813 | 0 |
| 0.0252499999999813 | 0 |
| 0.0262599999999813 | 0 |
| 0.0272699999999813 | 0 |
| 0.0282799999999813 | 0 |
| 0.0292899999999813 | 0 |
| 0.0302999999999813 | 0 |
| 0.0313099999999813 | 0 |
| 0.0323199999999813 | 0 |
| 0.0333299999999813 | 0 |
| 0.0343399999999813 | 0 |
| 0.0353499999999813 | 0 |
| 0.0363599999999813 | 0 |
| 0.0373699999999813 | 0 |
| 0.0383799999999813 | 0 |
| 0.0393899999999813 | 0 |
| 0.0403999999999813 | 0 |
| 0.0414099999999813 | 0 |
| 0.0424199999999813 | 0 |
| 0.0434299999999813 | 0 |
| 0.0444399999999812 | 0 |
| 0.0454499999999812 | 0 |
| 0.0464599999999812 | 0 |
| 0.0474699999999812 | 0 |
| 0.0484799999999812 | 0 |
| 0.0494899999999812 | 0 |
| 0.0504999999999812 | 0 |
| 0.0515099999999812 | 0 |
| 0.0525199999999812 | 0 |
| 0.0535299999999812 | 0 |
| 0.0545399999999812 | 0 |
| 0.0555499999999812 | 0 |
| 0.0565599999999812 | 0 |
| 0.0575699999999812 | 0 |
| 0.0585799999999812 | 0 |
| 0.0595899999999812 | 0 |
| 0.0605999999999812 | 0 |
| 0.0616099999999812 | 0 |
| 0.0626199999999812 | 0 |
| 0.0636299999999812 | 0 |
| 0.0646399999999812 | 0 |
| 0.0656499999999812 | 0 |
| 0.0666599999999812 | 0 |
| 0.0676699999999812 | 0 |
| 0.0686799999999812 | 0 |
| 0.0696899999999812 | 0 |
| 0.0706999999999812 | 0 |
| 0.0717099999999812 | 0 |
| 0.0727199999999812 | 0 |
| 0.0737299999999812 | 0 |
| 0.0747399999999812 | 0 |
| 0.0757499999999812 | 0 |
| 0.0767599999999812 | 0 |
| 0.0777699999999812 | 0 |
| 0.0787799999999811 | 0 |
| 0.0797899999999811 | -0.001 |
| 0.0807999999999811 | -0.001 |
| 0.0818099999999811 | -0.001 |
| 0.0828199999999811 | -0.001 |
| 0.0838299999999811 | -0.001 |
| 0.0848399999999811 | -0.001 |
| 0.0858499999999811 | -0.001 |
| 0.0868599999999811 | -0.001 |
| 0.0878699999999811 | -0.001 |
| 0.0888799999999811 | -0.001 |
| 0.0898899999999811 | -0.001 |
| 0.0908999999999811 | -0.001 |
| 0.0919099999999811 | -0.001 |
| 0.0929199999999811 | -0.001 |
| 0.0939299999999811 | -0.001 |
| 0.0949399999999811 | -0.001 |
| 0.0959499999999811 | -0.001 |
| 0.0969599999999811 | -0.001 |
| 0.0979699999999811 | -0.001 |
| 0.0989799999999811 | -0.001 |
| 0.0999899999999811 | -0.001 |
| 0.100999999999981 | -0.001 |
| 0.102009999999981 | -0.001 |
| 0.103019999999981 | -0.001 |
| 0.104029999999981 | -0.001 |
| 0.105039999999981 | -0.001 |
| 0.106049999999981 | -0.001 |
| 0.107059999999981 | -0.001 |
| 0.108069999999981 | -0.001 |
| 0.109079999999981 | -0.001 |
| 0.110089999999981 | -0.001 |
| 0.111099999999981 | -0.001 |
| 0.112109999999981 | -0.001 |
| 0.113119999999981 | -0.001 |
| 0.114129999999981 | -0.001 |
| 0.115139999999981 | -0.002 |
| 0.116149999999981 | -0.002 |
| 0.117159999999981 | -0.002 |
| 0.118169999999981 | -0.002 |
| 0.119179999999981 | -0.002 |
| 0.120189999999981 | -0.002 |
| 0.121199999999981 | -0.002 |
| 0.122209999999981 | -0.002 |
| 0.123219999999981 | -0.002 |
| 0.124229999999981 | -0.002 |
| 0.125239999999981 | -0.002 |
| 0.126249999999981 | -0.002 |
| 0.127259999999981 | -0.002 |
| 0.128269999999981 | -0.002 |
| 0.129279999999981 | -0.002 |
| 0.130289999999981 | -0.002 |
| 0.131299999999981 | -0.002 |
| 0.132309999999981 | -0.002 |
| 0.133319999999981 | -0.002 |
| 0.134329999999981 | -0.002 |
| 0.135339999999981 | -0.002 |
| 0.136349999999981 | -0.003 |
| 0.137359999999981 | -0.003 |
| 0.138369999999981 | -0.003 |
| 0.139379999999981 | -0.003 |
| 0.140389999999981 | -0.003 |
| 0.141399999999981 | -0.003 |
| 0.142409999999981 | -0.003 |
| 0.143419999999981 | -0.003 |
| 0.144429999999981 | -0.003 |
| 0.145439999999981 | -0.003 |
| 0.146449999999981 | -0.003 |
| 0.147459999999981 | -0.003 |
| 0.148469999999981 | -0.003 |
| 0.149479999999981 | -0.003 |
| 0.150489999999981 | -0.003 |
| 0.151499999999981 | -0.003 |
| 0.152509999999981 | -0.004 |
| 0.153519999999981 | -0.004 |
| 0.154529999999981 | -0.004 |
| 0.155539999999981 | -0.004 |
| 0.156549999999981 | -0.004 |
| 0.157559999999981 | -0.004 |
| 0.158569999999981 | -0.004 |
| 0.159579999999981 | -0.004 |
| 0.160589999999981 | -0.004 |
| 0.161599999999981 | -0.004 |
| 0.162609999999981 | -0.004 |
| 0.163619999999981 | -0.004 |
| 0.164629999999981 | -0.004 |
| 0.165639999999981 | -0.005 |
| 0.166649999999981 | -0.005 |
| 0.167659999999981 | -0.005 |
| 0.168669999999981 | -0.005 |
| 0.169679999999981 | -0.005 |
| 0.170689999999982 | -0.005 |
| 0.171699999999982 | -0.005 |
| 0.172709999999982 | -0.005 |
| 0.173719999999982 | -0.005 |
| 0.174729999999982 | -0.005 |
| 0.175739999999982 | -0.005 |
| 0.176749999999982 | -0.006 |
| 0.177759999999982 | -0.006 |
| 0.178769999999982 | -0.006 |
| 0.179779999999982 | -0.006 |
| 0.180789999999982 | -0.006 |
| 0.181799999999982 | -0.006 |
| 0.182809999999982 | -0.006 |
| 0.183819999999982 | -0.006 |
| 0.184829999999982 | -0.006 |
| 0.185839999999982 | -0.006 |
| 0.186849999999982 | -0.007 |
| 0.187859999999982 | -0.007 |
| 0.188869999999982 | -0.007 |
| 0.189879999999982 | -0.007 |
| 0.190889999999982 | -0.007 |
| 0.191899999999982 | -0.007 |
| 0.192909999999982 | -0.007 |
| 0.193919999999982 | -0.007 |
| 0.194929999999982 | -0.007 |
| 0.195939999999982 | -0.008 |
| 0.196949999999982 | -0.008 |
| 0.197959999999982 | -0.008 |
| 0.198969999999982 | -0.008 |
| 0.199979999999982 | -0.008 |
| 0.200989999999982 | -0.008 |
| 0.201999999999982 | -0.008 |
| 0.203009999999982 | -0.008 |
| 0.204019999999982 | -0.008 |
| 0.205029999999982 | -0.009 |
| 0.206039999999982 | -0.009 |
| 0.207049999999982 | -0.009 |
| 0.208059999999982 | -0.009 |
| 0.209069999999982 | -0.009 |
| 0.210079999999982 | -0.009 |
| 0.211089999999982 | -0.009 |
| 0.212099999999982 | -0.01 |
| 0.213109999999982 | -0.01 |
| 0.214119999999982 | -0.01 |
| 0.215129999999982 | -0.01 |
| 0.216139999999982 | -0.01 |
| 0.217149999999982 | -0.01 |
| 0.218159999999982 | -0.01 |
| 0.219169999999982 | -0.011 |
| 0.220179999999982 | -0.011 |
| 0.221189999999982 | -0.011 |
| 0.222199999999982 | -0.011 |
| 0.223209999999982 | -0.011 |
| 0.224219999999982 | -0.011 |
| 0.225229999999982 | -0.011 |
| 0.226239999999982 | -0.012 |
| 0.227249999999982 | -0.012 |
| 0.228259999999982 | -0.012 |
| 0.229269999999982 | -0.012 |
| 0.230279999999982 | -0.012 |
| 0.231289999999982 | -0.012 |
| 0.232299999999982 | -0.013 |
| 0.233309999999982 | -0.013 |
| 0.234319999999982 | -0.013 |
| 0.235329999999982 | -0.013 |
| 0.236339999999982 | -0.013 |
| 0.237349999999982 | -0.013 |
| 0.238359999999982 | -0.014 |
| 0.239369999999982 | -0.014 |
| 0.240379999999982 | -0.014 |
| 0.241389999999982 | -0.014 |
| 0.242399999999982 | -0.014 |
| 0.243409999999982 | -0.014 |
| 0.244419999999982 | -0.015 |
| 0.245429999999982 | -0.015 |
| 0.246439999999982 | -0.015 |
| 0.247449999999982 | -0.015 |
| 0.248459999999982 | -0.015 |
| 0.249469999999982 | -0.016 |
| 0.250479999999982 | -0.016 |
| 0.251489999999982 | -0.016 |
| 0.252499999999982 | -0.016 |
| 0.253509999999982 | -0.016 |
| 0.254519999999982 | -0.016 |
| 0.255529999999982 | -0.017 |
| 0.256539999999982 | -0.017 |
| 0.257549999999982 | -0.017 |
| 0.258559999999982 | -0.017 |
| 0.259569999999982 | -0.017 |
| 0.260579999999982 | -0.018 |
| 0.261589999999982 | -0.018 |
| 0.262599999999982 | -0.018 |
| 0.263609999999983 | -0.018 |
| 0.264619999999983 | -0.019 |
| 0.265629999999983 | -0.019 |
| 0.266639999999983 | -0.019 |
| 0.267649999999983 | -0.019 |
| 0.268659999999983 | -0.019 |
| 0.269669999999983 | -0.02 |
| 0.270679999999983 | -0.02 |
| 0.271689999999983 | -0.02 |
| 0.272699999999983 | -0.02 |
| 0.273709999999983 | -0.021 |
| 0.274719999999983 | -0.021 |
| 0.275729999999983 | -0.021 |
| 0.276739999999983 | -0.021 |
| 0.277749999999983 | -0.021 |
| 0.278759999999983 | -0.022 |
| 0.279769999999983 | -0.022 |
| 0.280779999999983 | -0.022 |
| 0.281789999999983 | -0.022 |
| 0.282799999999983 | -0.023 |
| 0.283809999999983 | -0.023 |
| 0.284819999999983 | -0.023 |
| 0.285829999999983 | -0.023 |
| 0.286839999999983 | -0.024 |
| 0.287849999999983 | -0.024 |
| 0.288859999999983 | -0.024 |
| 0.289869999999983 | -0.024 |
| 0.290879999999983 | -0.025 |
| 0.291889999999983 | -0.025 |
| 0.292899999999983 | -0.025 |
| 0.293909999999983 | -0.025 |
| 0.294919999999983 | -0.026 |
| 0.295929999999983 | -0.026 |
| 0.296939999999983 | -0.026 |
| 0.297949999999983 | -0.026 |
| 0.298959999999983 | -0.027 |
| 0.299969999999983 | -0.027 |
| 0.300979999999983 | -0.027 |
| 0.301989999999983 | -0.028 |
| 0.302999999999983 | -0.028 |
| 0.304009999999983 | -0.028 |
| 0.305019999999983 | -0.028 |
| 0.306029999999983 | -0.029 |
| 0.307039999999983 | -0.029 |
| 0.308049999999983 | -0.029 |
| 0.309059999999983 | -0.03 |
| 0.310069999999983 | -0.03 |
| 0.311079999999983 | -0.03 |
| 0.312089999999983 | -0.03 |
| 0.313099999999983 | -0.031 |
| 0.314109999999983 | -0.031 |
| 0.315119999999983 | -0.031 |
| 0.316129999999983 | -0.032 |
| 0.317139999999983 | -0.032 |
| 0.318149999999983 | -0.032 |
| 0.319159999999983 | -0.033 |
| 0.320169999999983 | -0.033 |
| 0.321179999999983 | -0.033 |
| 0.322189999999983 | -0.033 |
| 0.323199999999983 | -0.034 |
| 0.324209999999983 | -0.034 |
| 0.325219999999983 | -0.034 |
| 0.326229999999983 | -0.035 |
| 0.327239999999983 | -0.035 |
| 0.328249999999983 | -0.035 |
| 0.329259999999983 | -0.036 |
| 0.330269999999983 | -0.036 |
| 0.331279999999983 | -0.036 |
| 0.332289999999983 | -0.037 |
| 0.333299999999983 | -0.037 |
| 0.334309999999983 | -0.037 |
| 0.335319999999983 | -0.038 |
| 0.336329999999983 | -0.038 |
| 0.337339999999983 | -0.038 |
| 0.338349999999983 | -0.039 |
| 0.339359999999983 | -0.039 |
| 0.340369999999983 | -0.039 |
| 0.341379999999983 | -0.04 |
| 0.342389999999983 | -0.04 |
| 0.343399999999983 | -0.04 |
| 0.344409999999983 | -0.041 |
| 0.345419999999983 | -0.041 |
| 0.346429999999983 | -0.042 |
| 0.347439999999983 | -0.042 |
| 0.348449999999983 | -0.042 |
| 0.349459999999983 | -0.043 |
| 0.350469999999983 | -0.043 |
| 0.351479999999983 | -0.043 |
| 0.352489999999983 | -0.044 |
| 0.353499999999983 | -0.044 |
| 0.354509999999983 | -0.045 |
| 0.355519999999983 | -0.045 |
| 0.356529999999983 | -0.045 |
| 0.357539999999983 | -0.046 |
| 0.358549999999983 | -0.046 |
| 0.359559999999984 | -0.046 |
| 0.360569999999984 | -0.047 |
| 0.361579999999984 | -0.047 |
| 0.362589999999984 | -0.048 |
| 0.363599999999984 | -0.048 |
| 0.364609999999984 | -0.048 |
| 0.365619999999984 | -0.049 |
| 0.366629999999984 | -0.049 |
| 0.367639999999984 | -0.05 |
| 0.368649999999984 | -0.05 |
| 0.369659999999984 | -0.051 |
| 0.370669999999984 | -0.051 |
| 0.371679999999984 | -0.051 |
| 0.372689999999984 | -0.052 |
| 0.373699999999984 | -0.052 |
| 0.374709999999984 | -0.053 |
| 0.375719999999984 | -0.053 |
| 0.376729999999984 | -0.053 |
| 0.377739999999984 | -0.054 |
| 0.378749999999984 | -0.054 |
| 0.379759999999984 | -0.055 |
| 0.380769999999984 | -0.055 |
| 0.381779999999984 | -0.056 |
| 0.382789999999984 | -0.056 |
| 0.383799999999984 | -0.057 |
| 0.384809999999984 | -0.057 |
| 0.385819999999984 | -0.057 |
| 0.386829999999984 | -0.058 |
| 0.387839999999984 | -0.058 |
| 0.388849999999984 | -0.059 |
| 0.389859999999984 | -0.059 |
| 0.390869999999984 | -0.06 |
| 0.391879999999984 | -0.06 |
| 0.392889999999984 | -0.061 |
| 0.393899999999984 | -0.061 |
| 0.394909999999984 | -0.062 |
| 0.395919999999984 | -0.062 |
| 0.396929999999984 | -0.063 |
| 0.397939999999984 | -0.063 |
| 0.398949999999984 | -0.063 |
| 0.399959999999984 | -0.064 |
| 0.400969999999984 | -0.064 |
| 0.401979999999984 | -0.065 |
| 0.402989999999984 | -0.065 |
| 0.403999999999984 | -0.066 |
| 0.405009999999984 | -0.066 |
| 0.406019999999984 | -0.067 |
| 0.407029999999984 | -0.067 |
| 0.408039999999984 | -0.068 |
| 0.409049999999984 | -0.068 |
| 0.410059999999984 | -0.069 |
| 0.411069999999984 | -0.069 |
| 0.412079999999984 | -0.07 |
| 0.413089999999984 | -0.07 |
| 0.414099999999984 | -0.071 |
| 0.415109999999984 | -0.072 |
| 0.416119999999984 | -0.072 |
| 0.417129999999984 | -0.073 |
| 0.418139999999984 | -0.073 |
| 0.419149999999984 | -0.074 |
| 0.420159999999984 | -0.074 |
| 0.421169999999984 | -0.075 |
| 0.422179999999984 | -0.075 |
| 0.423189999999984 | -0.076 |
| 0.424199999999984 | -0.076 |
| 0.425209999999984 | -0.077 |
| 0.426219999999984 | -0.077 |
| 0.427229999999984 | -0.078 |
| 0.428239999999984 | -0.079 |
| 0.429249999999984 | -0.079 |
| 0.430259999999984 | -0.08 |
| 0.431269999999984 | -0.08 |
| 0.432279999999984 | -0.081 |
| 0.433289999999984 | -0.081 |
| 0.434299999999984 | -0.082 |
| 0.435309999999984 | -0.082 |
| 0.436319999999984 | -0.083 |
| 0.437329999999984 | -0.084 |
| 0.438339999999984 | -0.084 |
| 0.439349999999984 | -0.085 |
| 0.440359999999984 | -0.085 |
| 0.441369999999984 | -0.086 |
| 0.442379999999984 | -0.087 |
| 0.443389999999984 | -0.087 |
| 0.444399999999984 | -0.088 |
| 0.445409999999984 | -0.088 |
| 0.446419999999984 | -0.089 |
| 0.447429999999984 | -0.09 |
| 0.448439999999984 | -0.09 |
| 0.449449999999984 | -0.091 |
| 0.450459999999985 | -0.091 |
| 0.451469999999985 | -0.092 |
| 0.452479999999985 | -0.093 |
| 0.453489999999985 | -0.093 |
| 0.454499999999985 | -0.094 |
| 0.455509999999985 | -0.095 |
| 0.456519999999985 | -0.095 |
| 0.457529999999985 | -0.096 |
| 0.458539999999985 | -0.096 |
| 0.459549999999985 | -0.097 |
| 0.460559999999985 | -0.098 |
| 0.461569999999985 | -0.098 |
| 0.462579999999985 | -0.099 |
| 0.463589999999985 | -0.1 |
| 0.464599999999985 | -0.1 |
| 0.465609999999985 | -0.101 |
| 0.466619999999985 | -0.102 |
| 0.467629999999985 | -0.102 |
| 0.468639999999985 | -0.103 |
| 0.469649999999985 | -0.104 |
| 0.470659999999985 | -0.104 |
| 0.471669999999985 | -0.105 |
| 0.472679999999985 | -0.106 |
| 0.473689999999985 | -0.106 |
| 0.474699999999985 | -0.107 |
| 0.475709999999985 | -0.108 |
| 0.476719999999985 | -0.108 |
| 0.477729999999985 | -0.109 |
| 0.478739999999985 | -0.11 |
| 0.479749999999985 | -0.11 |
| 0.480759999999985 | -0.111 |
| 0.481769999999985 | -0.112 |
| 0.482779999999985 | -0.113 |
| 0.483789999999985 | -0.113 |
| 0.484799999999985 | -0.114 |
| 0.485809999999985 | -0.115 |
| 0.486819999999985 | -0.115 |
| 0.487829999999985 | -0.116 |
| 0.488839999999985 | -0.117 |
| 0.489849999999985 | -0.118 |
| 0.490859999999985 | -0.118 |
| 0.491869999999985 | -0.119 |
| 0.492879999999985 | -0.12 |
| 0.493889999999985 | -0.12 |
| 0.494899999999985 | -0.121 |
| 0.495909999999985 | -0.122 |
| 0.496919999999985 | -0.123 |
| 0.497929999999985 | -0.123 |
| 0.498939999999985 | -0.124 |
| 0.499949999999985 | -0.125 |
| 0.500959999999985 | -0.126 |
| 0.501969999999985 | -0.126 |
| 0.502979999999985 | -0.127 |
| 0.503989999999985 | -0.128 |
| 0.504999999999985 | -0.129 |
| 0.506009999999985 | -0.13 |
| 0.507019999999985 | -0.13 |
| 0.508029999999985 | -0.131 |
| 0.509039999999985 | -0.132 |
| 0.510049999999985 | -0.133 |
| 0.511059999999985 | -0.133 |
| 0.512069999999985 | -0.134 |
| 0.513079999999985 | -0.135 |
| 0.514089999999985 | -0.136 |
| 0.515099999999984 | -0.137 |
| 0.516109999999984 | -0.137 |
| 0.517119999999984 | -0.138 |
| 0.518129999999984 | -0.139 |
| 0.519139999999984 | -0.14 |
| 0.520149999999984 | -0.141 |
| 0.521159999999984 | -0.142 |
| 0.522169999999984 | -0.142 |
| 0.523179999999984 | -0.143 |
| 0.524189999999984 | -0.144 |
| 0.525199999999984 | -0.145 |
| 0.526209999999984 | -0.146 |
| 0.527219999999984 | -0.147 |
| 0.528229999999984 | -0.147 |
| 0.529239999999984 | -0.148 |
| 0.530249999999984 | -0.149 |
| 0.531259999999984 | -0.15 |
| 0.532269999999984 | -0.151 |
| 0.533279999999984 | -0.152 |
| 0.534289999999984 | -0.153 |
| 0.535299999999984 | -0.153 |
| 0.536309999999984 | -0.154 |
| 0.537319999999983 | -0.155 |
| 0.538329999999983 | -0.156 |
| 0.539339999999983 | -0.157 |
| 0.540349999999983 | -0.158 |
| 0.541359999999983 | -0.159 |
| 0.542369999999983 | -0.16 |
| 0.543379999999983 | -0.16 |
| 0.544389999999983 | -0.161 |
| 0.545399999999983 | -0.162 |
| 0.546409999999983 | -0.163 |
| 0.547419999999983 | -0.164 |
| 0.548429999999983 | -0.165 |
| 0.549439999999983 | -0.166 |
| 0.550449999999983 | -0.167 |
| 0.551459999999983 | -0.168 |
| 0.552469999999983 | -0.169 |
| 0.553479999999983 | -0.17 |
| 0.554489999999983 | -0.17 |
| 0.555499999999983 | -0.171 |
| 0.556509999999983 | -0.172 |
| 0.557519999999983 | -0.173 |
| 0.558529999999983 | -0.174 |
| 0.559539999999982 | -0.175 |
| 0.560549999999982 | -0.176 |
| 0.561559999999982 | -0.177 |
| 0.562569999999982 | -0.178 |
| 0.563579999999982 | -0.179 |
| 0.564589999999982 | -0.18 |
| 0.565599999999982 | -0.181 |
| 0.566609999999982 | -0.182 |
| 0.567619999999982 | -0.183 |
| 0.568629999999982 | -0.184 |
| 0.569639999999982 | -0.185 |
| 0.570649999999982 | -0.186 |
| 0.571659999999982 | -0.187 |
| 0.572669999999982 | -0.188 |
| 0.573679999999982 | -0.189 |
| 0.574689999999982 | -0.19 |
| 0.575699999999982 | -0.191 |
| 0.576709999999982 | -0.192 |
| 0.577719999999982 | -0.193 |
| 0.578729999999982 | -0.194 |
| 0.579739999999982 | -0.195 |
| 0.580749999999982 | -0.196 |
| 0.581759999999981 | -0.197 |
| 0.582769999999981 | -0.198 |
| 0.583779999999981 | -0.199 |
| 0.584789999999981 | -0.2 |
| 0.585799999999981 | -0.201 |
| 0.586809999999981 | -0.202 |
| 0.587819999999981 | -0.203 |
| 0.588829999999981 | -0.204 |
| 0.589839999999981 | -0.205 |
| 0.590849999999981 | -0.206 |
| 0.591859999999981 | -0.207 |
| 0.592869999999981 | -0.208 |
| 0.593879999999981 | -0.209 |
| 0.594889999999981 | -0.211 |
| 0.595899999999981 | -0.212 |
| 0.596909999999981 | -0.213 |
| 0.597919999999981 | -0.214 |
| 0.598929999999981 | -0.215 |
| 0.599939999999981 | -0.216 |
| 0.600949999999981 | -0.217 |
| 0.601959999999981 | -0.218 |
| 0.60296999999998 | -0.219 |
| 0.60397999999998 | -0.22 |
| 0.60498999999998 | -0.221 |
| 0.60599999999998 | -0.223 |
| 0.60700999999998 | -0.224 |
| 0.60801999999998 | -0.225 |
| 0.60902999999998 | -0.226 |
| 0.61003999999998 | -0.227 |
| 0.61104999999998 | -0.228 |
| 0.61205999999998 | -0.229 |
| 0.61306999999998 | -0.23 |
| 0.61407999999998 | -0.232 |
| 0.61508999999998 | -0.233 |
| 0.61609999999998 | -0.234 |
| 0.61710999999998 | -0.235 |
| 0.61811999999998 | -0.236 |
| 0.61912999999998 | -0.237 |
| 0.62013999999998 | -0.238 |
| 0.62114999999998 | -0.24 |
| 0.62215999999998 | -0.241 |
| 0.62316999999998 | -0.242 |
| 0.62417999999998 | -0.243 |
| 0.62518999999998 | -0.244 |
| 0.626199999999979 | -0.246 |
| 0.627209999999979 | -0.247 |
| 0.628219999999979 | -0.248 |
| 0.629229999999979 | -0.249 |
| 0.630239999999979 | -0.25 |
| 0.631249999999979 | -0.252 |
| 0.632259999999979 | -0.253 |
| 0.633269999999979 | -0.254 |
| 0.634279999999979 | -0.255 |
| 0.635289999999979 | -0.256 |
| 0.636299999999979 | -0.258 |
| 0.637309999999979 | -0.259 |
| 0.638319999999979 | -0.26 |
| 0.639329999999979 | -0.261 |
| 0.640339999999979 | -0.263 |
| 0.641349999999979 | -0.264 |
| 0.642359999999979 | -0.265 |
| 0.643369999999979 | -0.266 |
| 0.644379999999979 | -0.268 |
| 0.645389999999979 | -0.269 |
| 0.646399999999979 | -0.27 |
| 0.647409999999979 | -0.271 |
| 0.648419999999978 | -0.273 |
| 0.649429999999978 | -0.274 |
| 0.650439999999978 | -0.275 |
| 0.651449999999978 | -0.276 |
| 0.652459999999978 | -0.278 |
| 0.653469999999978 | -0.279 |
| 0.654479999999978 | -0.28 |
| 0.655489999999978 | -0.282 |
| 0.656499999999978 | -0.283 |
| 0.657509999999978 | -0.284 |
| 0.658519999999978 | -0.286 |
| 0.659529999999978 | -0.287 |
| 0.660539999999978 | -0.288 |
| 0.661549999999978 | -0.29 |
| 0.662559999999978 | -0.291 |
| 0.663569999999978 | -0.292 |
| 0.664579999999978 | -0.294 |
| 0.665589999999978 | -0.295 |
| 0.666599999999978 | -0.296 |
| 0.667609999999978 | -0.298 |
| 0.668619999999978 | -0.299 |
| 0.669629999999978 | -0.3 |
| 0.670639999999977 | -0.302 |
| 0.671649999999977 | -0.303 |
| 0.672659999999977 | -0.304 |
| 0.673669999999977 | -0.306 |
| 0.674679999999977 | -0.307 |
| 0.675689999999977 | -0.308 |
| 0.676699999999977 | -0.31 |
| 0.677709999999977 | -0.311 |
| 0.678719999999977 | -0.313 |
| 0.679729999999977 | -0.314 |
| 0.680739999999977 | -0.315 |
| 0.681749999999977 | -0.317 |
| 0.682759999999977 | -0.318 |
| 0.683769999999977 | -0.32 |
| 0.684779999999977 | -0.321 |
| 0.685789999999977 | -0.323 |
| 0.686799999999977 | -0.324 |
| 0.687809999999977 | -0.325 |
| 0.688819999999977 | -0.327 |
| 0.689829999999977 | -0.328 |
| 0.690839999999977 | -0.33 |
| 0.691849999999977 | -0.331 |
| 0.692859999999976 | -0.333 |
| 0.693869999999976 | -0.334 |
| 0.694879999999976 | -0.336 |
| 0.695889999999976 | -0.337 |
| 0.696899999999976 | -0.338 |
| 0.697909999999976 | -0.34 |
| 0.698919999999976 | -0.341 |
| 0.699929999999976 | -0.343 |
| 0.700939999999976 | -0.344 |
| 0.701949999999976 | -0.346 |
| 0.702959999999976 | -0.347 |
| 0.703969999999976 | -0.349 |
| 0.704979999999976 | -0.35 |
| 0.705989999999976 | -0.352 |
| 0.706999999999976 | -0.353 |
| 0.708009999999976 | -0.355 |
| 0.709019999999976 | -0.356 |
| 0.710029999999976 | -0.358 |
| 0.711039999999976 | -0.359 |
| 0.712049999999976 | -0.361 |
| 0.713059999999976 | -0.363 |
| 0.714069999999976 | -0.364 |
| 0.715079999999976 | -0.366 |
| 0.716089999999976 | -0.367 |
| 0.717099999999975 | -0.369 |
| 0.718109999999975 | -0.37 |
| 0.719119999999975 | -0.372 |
| 0.720129999999975 | -0.373 |
| 0.721139999999975 | -0.375 |
| 0.722149999999975 | -0.377 |
| 0.723159999999975 | -0.378 |
| 0.724169999999975 | -0.38 |
| 0.725179999999975 | -0.381 |
| 0.726189999999975 | -0.383 |
| 0.727199999999975 | -0.385 |
| 0.728209999999975 | -0.386 |
| 0.729219999999975 | -0.388 |
| 0.730229999999975 | -0.389 |
| 0.731239999999975 | -0.391 |
| 0.732249999999975 | -0.393 |
| 0.733259999999975 | -0.394 |
| 0.734269999999975 | -0.396 |
| 0.735279999999975 | -0.398 |
| 0.736289999999975 | -0.399 |
| 0.737299999999975 | -0.401 |
| 0.738309999999975 | -0.402 |
| 0.739319999999974 | -0.404 |
| 0.740329999999974 | -0.406 |
| 0.741339999999974 | -0.407 |
| 0.742349999999974 | -0.409 |
| 0.743359999999974 | -0.411 |
| 0.744369999999974 | -0.412 |
| 0.745379999999974 | -0.414 |
| 0.746389999999974 | -0.416 |
| 0.747399999999974 | -0.418 |
| 0.748409999999974 | -0.419 |
| 0.749419999999974 | -0.421 |
| 0.750429999999974 | -0.423 |
| 0.751439999999974 | -0.424 |
| 0.752449999999974 | -0.426 |
| 0.753459999999974 | -0.428 |
| 0.754469999999974 | -0.429 |
| 0.755479999999974 | -0.431 |
| 0.756489999999974 | -0.433 |
| 0.757499999999974 | -0.435 |
| 0.758509999999974 | -0.436 |
| 0.759519999999974 | -0.438 |
| 0.760529999999974 | -0.44 |
| 0.761539999999973 | -0.442 |
| 0.762549999999973 | -0.443 |
| 0.763559999999973 | -0.445 |
| 0.764569999999973 | -0.447 |
| 0.765579999999973 | -0.449 |
| 0.766589999999973 | -0.45 |
| 0.767599999999973 | -0.452 |
| 0.768609999999973 | -0.454 |
| 0.769619999999973 | -0.456 |
| 0.770629999999973 | -0.458 |
| 0.771639999999973 | -0.459 |
| 0.772649999999973 | -0.461 |
| 0.773659999999973 | -0.463 |
| 0.774669999999973 | -0.465 |
| 0.775679999999973 | -0.467 |
| 0.776689999999973 | -0.469 |
| 0.777699999999973 | -0.47 |
| 0.778709999999973 | -0.472 |
| 0.779719999999973 | -0.474 |
| 0.780729999999973 | -0.476 |
| 0.781739999999973 | -0.478 |
| 0.782749999999973 | -0.48 |
| 0.783759999999973 | -0.481 |
| 0.784769999999972 | -0.483 |
| 0.785779999999972 | -0.485 |
| 0.786789999999972 | -0.487 |
| 0.787799999999972 | -0.489 |
| 0.788809999999972 | -0.491 |
| 0.789819999999972 | -0.493 |
| 0.790829999999972 | -0.495 |
| 0.791839999999972 | -0.496 |
| 0.792849999999972 | -0.498 |
| 0.793859999999972 | -0.5 |
| 0.794869999999972 | -0.502 |
| 0.795879999999972 | -0.504 |
| 0.796889999999972 | -0.506 |
| 0.797899999999972 | -0.508 |
| 0.798909999999972 | -0.51 |
| 0.799919999999972 | -0.512 |
| 0.800929999999972 | -0.514 |
| 0.801939999999972 | -0.516 |
| 0.802949999999972 | -0.518 |
| 0.803959999999972 | -0.52 |
| 0.804969999999972 | -0.522 |
| 0.805979999999972 | -0.524 |
| 0.806989999999972 | -0.526 |
| 0.807999999999971 | -0.528 |
| 0.809009999999971 | -0.529 |
| 0.810019999999971 | -0.531 |
| 0.811029999999971 | -0.533 |
| 0.812039999999971 | -0.535 |
| 0.813049999999971 | -0.537 |
| 0.814059999999971 | -0.539 |
| 0.815069999999971 | -0.541 |
| 0.816079999999971 | -0.543 |
| 0.817089999999971 | -0.546 |
| 0.818099999999971 | -0.548 |
| 0.819109999999971 | -0.55 |
| 0.820119999999971 | -0.552 |
| 0.821129999999971 | -0.554 |
| 0.822139999999971 | -0.556 |
| 0.823149999999971 | -0.558 |
| 0.824159999999971 | -0.56 |
| 0.825169999999971 | -0.562 |
| 0.826179999999971 | -0.564 |
| 0.827189999999971 | -0.566 |
| 0.828199999999971 | -0.568 |
| 0.829209999999971 | -0.57 |
| 0.83021999999997 | -0.572 |
| 0.83122999999997 | -0.574 |
| 0.83223999999997 | -0.576 |
| 0.83324999999997 | -0.579 |
| 0.83425999999997 | -0.581 |
| 0.83526999999997 | -0.583 |
| 0.83627999999997 | -0.585 |
| 0.83728999999997 | -0.587 |
| 0.83829999999997 | -0.589 |
| 0.83930999999997 | -0.591 |
| 0.84031999999997 | -0.593 |
| 0.84132999999997 | -0.596 |
| 0.84233999999997 | -0.598 |
| 0.84334999999997 | -0.6 |
| 0.84435999999997 | -0.602 |
| 0.84536999999997 | -0.604 |
| 0.84637999999997 | -0.606 |
| 0.84738999999997 | -0.608 |
| 0.84839999999997 | -0.611 |
| 0.84940999999997 | -0.613 |
| 0.85041999999997 | -0.615 |
| 0.85142999999997 | -0.617 |
| 0.85243999999997 | -0.619 |
| 0.853449999999969 | -0.622 |
| 0.854459999999969 | -0.624 |
| 0.855469999999969 | -0.626 |
| 0.856479999999969 | -0.628 |
| 0.857489999999969 | -0.631 |
| 0.858499999999969 | -0.633 |
| 0.859509999999969 | -0.635 |
| 0.860519999999969 | -0.637 |
| 0.861529999999969 | -0.639 |
| 0.862539999999969 | -0.642 |
| 0.863549999999969 | -0.644 |
| 0.864559999999969 | -0.646 |
| 0.865569999999969 | -0.648 |
| 0.866579999999969 | -0.651 |
| 0.867589999999969 | -0.653 |
| 0.868599999999969 | -0.655 |
| 0.869609999999969 | -0.658 |
| 0.870619999999969 | -0.66 |
| 0.871629999999969 | -0.662 |
| 0.872639999999969 | -0.665 |
| 0.873649999999969 | -0.667 |
| 0.874659999999969 | -0.669 |
| 0.875669999999968 | -0.671 |
| 0.876679999999968 | -0.674 |
| 0.877689999999968 | -0.676 |
| 0.878699999999968 | -0.678 |
| 0.879709999999968 | -0.681 |
| 0.880719999999968 | -0.683 |
| 0.881729999999968 | -0.685 |
| 0.882739999999968 | -0.688 |
| 0.883749999999968 | -0.69 |
| 0.884759999999968 | -0.693 |
| 0.885769999999968 | -0.695 |
| 0.886779999999968 | -0.697 |
| 0.887789999999968 | -0.7 |
| 0.888799999999968 | -0.702 |
| 0.889809999999968 | -0.705 |
| 0.890819999999968 | -0.707 |
| 0.891829999999968 | -0.709 |
| 0.892839999999968 | -0.712 |
| 0.893849999999968 | -0.714 |
| 0.894859999999968 | -0.717 |
| 0.895869999999968 | -0.719 |
| 0.896879999999968 | -0.721 |
| 0.897889999999967 | -0.724 |
| 0.898899999999967 | -0.726 |
| 0.899909999999967 | -0.729 |
| 0.900919999999967 | -0.731 |
| 0.901929999999967 | -0.734 |
| 0.902939999999967 | -0.736 |
| 0.903949999999967 | -0.739 |
| 0.904959999999967 | -0.741 |
| 0.905969999999967 | -0.744 |
| 0.906979999999967 | -0.746 |
| 0.907989999999967 | -0.749 |
| 0.908999999999967 | -0.751 |
| 0.910009999999967 | -0.754 |
| 0.911019999999967 | -0.756 |
| 0.912029999999967 | -0.759 |
| 0.913039999999967 | -0.761 |
| 0.914049999999967 | -0.764 |
| 0.915059999999967 | -0.766 |
| 0.916069999999967 | -0.769 |
| 0.917079999999967 | -0.771 |
| 0.918089999999967 | -0.774 |
| 0.919099999999967 | -0.776 |
| 0.920109999999967 | -0.779 |
| 0.921119999999966 | -0.782 |
| 0.922129999999966 | -0.784 |
| 0.923139999999966 | -0.787 |
| 0.924149999999966 | -0.789 |
| 0.925159999999966 | -0.792 |
| 0.926169999999966 | -0.794 |
| 0.927179999999966 | -0.797 |
| 0.928189999999966 | -0.8 |
| 0.929199999999966 | -0.802 |
| 0.930209999999966 | -0.805 |
| 0.931219999999966 | -0.808 |
| 0.932229999999966 | -0.81 |
| 0.933239999999966 | -0.813 |
| 0.934249999999966 | -0.815 |
| 0.935259999999966 | -0.818 |
| 0.936269999999966 | -0.821 |
| 0.937279999999966 | -0.823 |
| 0.938289999999966 | -0.826 |
| 0.939299999999966 | -0.829 |
| 0.940309999999966 | -0.831 |
| 0.941319999999966 | -0.834 |
| 0.942329999999966 | -0.837 |
| 0.943339999999966 | -0.839 |
| 0.944349999999965 | -0.842 |
| 0.945359999999965 | -0.845 |
| 0.946369999999965 | -0.848 |
| 0.947379999999965 | -0.85 |
| 0.948389999999965 | -0.853 |
| 0.949399999999965 | -0.856 |
| 0.950409999999965 | -0.858 |
| 0.951419999999965 | -0.861 |
| 0.952429999999965 | -0.864 |
| 0.953439999999965 | -0.867 |
| 0.954449999999965 | -0.869 |
| 0.955459999999965 | -0.872 |
| 0.956469999999965 | -0.875 |
| 0.957479999999965 | -0.878 |
| 0.958489999999965 | -0.881 |
| 0.959499999999965 | -0.883 |
| 0.960509999999965 | -0.886 |
| 0.961519999999965 | -0.889 |
| 0.962529999999965 | -0.892 |
| 0.963539999999965 | -0.895 |
| 0.964549999999965 | -0.897 |
| 0.965559999999965 | -0.9 |
| 0.966569999999964 | -0.903 |
| 0.967579999999964 | -0.906 |
| 0.968589999999964 | -0.909 |
| 0.969599999999964 | -0.912 |
| 0.970609999999964 | -0.914 |
| 0.971619999999964 | -0.917 |
| 0.972629999999964 | -0.92 |
| 0.973639999999964 | -0.923 |
| 0.974649999999964 | -0.926 |
| 0.975659999999964 | -0.929 |
| 0.976669999999964 | -0.932 |
| 0.977679999999964 | -0.935 |
| 0.978689999999964 | -0.937 |
| 0.979699999999964 | -0.94 |
| 0.980709999999964 | -0.943 |
| 0.981719999999964 | -0.946 |
| 0.982729999999964 | -0.949 |
| 0.983739999999964 | -0.952 |
| 0.984749999999964 | -0.955 |
| 0.985759999999964 | -0.958 |
| 0.986769999999964 | -0.961 |
| 0.987779999999964 | -0.964 |
| 0.988789999999963 | -0.967 |
| 0.989799999999963 | -0.97 |
| 0.990809999999963 | -0.973 |
| 0.991819999999963 | -0.976 |
| 0.992829999999963 | -0.979 |
| 0.993839999999963 | -0.982 |
| 0.994849999999963 | -0.985 |
| 0.995859999999963 | -0.988 |
| 0.996869999999963 | -0.991 |
| 0.997879999999963 | -0.994 |
| 0.998889999999963 | -0.997 |
| 0.999899999999963 | -1 |
| 1.000909999999963 | -1.003 |
| 1.001919999999963 | -1.006 |
| 1.002929999999963 | -1.009 |
| 1.003939999999963 | -1.012 |
| 1.004949999999963 | -1.015 |
| 1.005959999999963 | -1.018 |
| 1.006969999999963 | -1.021 |
| 1.007979999999963 | -1.024 |
| 1.008989999999963 | -1.027 |
| 1.009999999999963 | -1.03 |